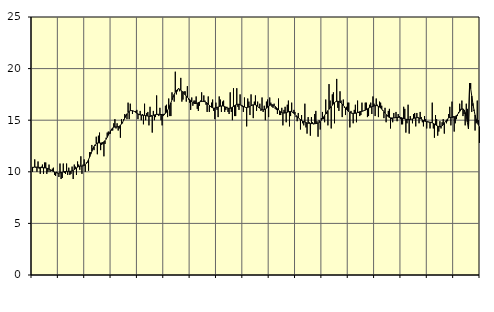
| Category | Piggar | Series 1 |
|---|---|---|
| nan | 10 | 10.45 |
| 87.0 | 10.4 | 10.44 |
| 87.0 | 11.2 | 10.46 |
| 87.0 | 10.4 | 10.46 |
| 87.0 | 10 | 10.45 |
| 87.0 | 11 | 10.44 |
| 87.0 | 10.3 | 10.43 |
| 87.0 | 9.8 | 10.42 |
| 87.0 | 10.5 | 10.41 |
| 87.0 | 10.7 | 10.4 |
| 87.0 | 9.8 | 10.39 |
| 87.0 | 10.9 | 10.38 |
| nan | 10.9 | 10.37 |
| 88.0 | 9.8 | 10.35 |
| 88.0 | 10 | 10.31 |
| 88.0 | 10.7 | 10.26 |
| 88.0 | 10 | 10.21 |
| 88.0 | 10.1 | 10.14 |
| 88.0 | 10.3 | 10.08 |
| 88.0 | 10.4 | 10.02 |
| 88.0 | 9.7 | 9.97 |
| 88.0 | 9.6 | 9.92 |
| 88.0 | 10 | 9.89 |
| 88.0 | 9.9 | 9.87 |
| nan | 9.5 | 9.87 |
| 89.0 | 10.8 | 9.89 |
| 89.0 | 9.3 | 9.92 |
| 89.0 | 9.4 | 9.95 |
| 89.0 | 10.8 | 9.99 |
| 89.0 | 9.9 | 10.02 |
| 89.0 | 9.8 | 10.03 |
| 89.0 | 10.8 | 10.04 |
| 89.0 | 9.7 | 10.04 |
| 89.0 | 10.4 | 10.04 |
| 89.0 | 9.7 | 10.04 |
| 89.0 | 9.8 | 10.06 |
| nan | 10.5 | 10.09 |
| 90.0 | 9.3 | 10.14 |
| 90.0 | 10.7 | 10.21 |
| 90.0 | 10.5 | 10.29 |
| 90.0 | 9.7 | 10.38 |
| 90.0 | 11 | 10.45 |
| 90.0 | 10.7 | 10.51 |
| 90.0 | 10.2 | 10.54 |
| 90.0 | 11.5 | 10.55 |
| 90.0 | 9.8 | 10.56 |
| 90.0 | 10.7 | 10.57 |
| 90.0 | 11.2 | 10.61 |
| nan | 10 | 10.69 |
| 91.0 | 10.9 | 10.81 |
| 91.0 | 10.9 | 10.98 |
| 91.0 | 10.1 | 11.19 |
| 91.0 | 11.9 | 11.44 |
| 91.0 | 11.9 | 11.71 |
| 91.0 | 12.6 | 11.98 |
| 91.0 | 12.3 | 12.23 |
| 91.0 | 12.1 | 12.45 |
| 91.0 | 12.5 | 12.62 |
| 91.0 | 13.4 | 12.73 |
| 91.0 | 11.7 | 12.79 |
| nan | 13.5 | 12.8 |
| 92.0 | 13.8 | 12.79 |
| 92.0 | 12.1 | 12.79 |
| 92.0 | 12.6 | 12.8 |
| 92.0 | 12.7 | 12.84 |
| 92.0 | 11.5 | 12.91 |
| 92.0 | 12.7 | 13.01 |
| 92.0 | 13.3 | 13.16 |
| 92.0 | 13.8 | 13.34 |
| 92.0 | 13.9 | 13.55 |
| 92.0 | 13.7 | 13.77 |
| 92.0 | 13.7 | 13.97 |
| nan | 14 | 14.14 |
| 93.0 | 14 | 14.26 |
| 93.0 | 14.7 | 14.32 |
| 93.0 | 15.1 | 14.34 |
| 93.0 | 14.2 | 14.35 |
| 93.0 | 14.7 | 14.35 |
| 93.0 | 14 | 14.37 |
| 93.0 | 14.2 | 14.42 |
| 93.0 | 13.3 | 14.51 |
| 93.0 | 15.1 | 14.63 |
| 93.0 | 14.7 | 14.8 |
| 93.0 | 15.1 | 15 |
| nan | 15.6 | 15.21 |
| 94.0 | 15.5 | 15.43 |
| 94.0 | 15.1 | 15.61 |
| 94.0 | 16.7 | 15.76 |
| 94.0 | 15.1 | 15.86 |
| 94.0 | 16.6 | 15.92 |
| 94.0 | 15.9 | 15.93 |
| 94.0 | 15.6 | 15.92 |
| 94.0 | 15.9 | 15.88 |
| 94.0 | 15.8 | 15.83 |
| 94.0 | 15.9 | 15.76 |
| 94.0 | 16 | 15.68 |
| nan | 15.1 | 15.61 |
| 95.0 | 15.6 | 15.55 |
| 95.0 | 15.9 | 15.51 |
| 95.0 | 15 | 15.49 |
| 95.0 | 15.6 | 15.48 |
| 95.0 | 14.6 | 15.48 |
| 95.0 | 16.6 | 15.47 |
| 95.0 | 15 | 15.45 |
| 95.0 | 15.7 | 15.42 |
| 95.0 | 15.8 | 15.4 |
| 95.0 | 14.5 | 15.37 |
| 95.0 | 16.3 | 15.37 |
| nan | 15.5 | 15.39 |
| 96.0 | 13.8 | 15.42 |
| 96.0 | 15.9 | 15.47 |
| 96.0 | 15 | 15.51 |
| 96.0 | 15.3 | 15.54 |
| 96.0 | 17.4 | 15.56 |
| 96.0 | 15.5 | 15.57 |
| 96.0 | 15.4 | 15.57 |
| 96.0 | 16.2 | 15.56 |
| 96.0 | 15 | 15.55 |
| 96.0 | 14.5 | 15.55 |
| 96.0 | 15.4 | 15.56 |
| nan | 15.5 | 15.59 |
| 97.0 | 16.4 | 15.66 |
| 97.0 | 16.5 | 15.78 |
| 97.0 | 15.3 | 15.96 |
| 97.0 | 17.1 | 16.17 |
| 97.0 | 15.4 | 16.42 |
| 97.0 | 15.4 | 16.69 |
| 97.0 | 17.7 | 16.97 |
| 97.0 | 17.3 | 17.25 |
| 97.0 | 16.8 | 17.5 |
| 97.0 | 19.7 | 17.72 |
| 97.0 | 17.5 | 17.88 |
| nan | 17.8 | 17.98 |
| 98.0 | 18.1 | 18.02 |
| 98.0 | 17.8 | 18 |
| 98.0 | 19.1 | 17.93 |
| 98.0 | 16.8 | 17.82 |
| 98.0 | 17 | 17.7 |
| 98.0 | 17.8 | 17.58 |
| 98.0 | 17.8 | 17.45 |
| 98.0 | 16.8 | 17.33 |
| 98.0 | 18.3 | 17.22 |
| 98.0 | 17 | 17.12 |
| 98.0 | 16.7 | 17.01 |
| nan | 16 | 16.9 |
| 99.0 | 17.2 | 16.8 |
| 99.0 | 16.4 | 16.71 |
| 99.0 | 16.9 | 16.65 |
| 99.0 | 16.9 | 16.61 |
| 99.0 | 17.3 | 16.62 |
| 99.0 | 16.1 | 16.65 |
| 99.0 | 15.9 | 16.71 |
| 99.0 | 16.4 | 16.76 |
| 99.0 | 16.9 | 16.8 |
| 99.0 | 17.7 | 16.81 |
| 99.0 | 16.8 | 16.82 |
| nan | 17.4 | 16.81 |
| 0.0 | 16.9 | 16.79 |
| 0.0 | 16.5 | 16.73 |
| 0.0 | 15.8 | 16.66 |
| 0.0 | 17.3 | 16.56 |
| 0.0 | 15.8 | 16.44 |
| 0.0 | 16.3 | 16.34 |
| 0.0 | 16.7 | 16.25 |
| 0.0 | 17 | 16.2 |
| 0.0 | 15.9 | 16.17 |
| 0.0 | 15.1 | 16.18 |
| 0.0 | 16.7 | 16.2 |
| nan | 16 | 16.24 |
| 1.0 | 15.3 | 16.28 |
| 1.0 | 17.3 | 16.32 |
| 1.0 | 17 | 16.36 |
| 1.0 | 15.8 | 16.38 |
| 1.0 | 16.8 | 16.38 |
| 1.0 | 16.9 | 16.36 |
| 1.0 | 15.8 | 16.32 |
| 1.0 | 16 | 16.26 |
| 1.0 | 16.3 | 16.2 |
| 1.0 | 15.8 | 16.16 |
| 1.0 | 15.6 | 16.15 |
| nan | 17.7 | 16.16 |
| 2.0 | 15.8 | 16.2 |
| 2.0 | 15 | 16.27 |
| 2.0 | 18.1 | 16.33 |
| 2.0 | 15.4 | 16.41 |
| 2.0 | 15.4 | 16.48 |
| 2.0 | 18.1 | 16.53 |
| 2.0 | 16.3 | 16.55 |
| 2.0 | 16 | 16.54 |
| 2.0 | 17.5 | 16.51 |
| 2.0 | 16.4 | 16.46 |
| 2.0 | 16.3 | 16.4 |
| nan | 15.8 | 16.34 |
| 3.0 | 17.2 | 16.28 |
| 3.0 | 16.2 | 16.24 |
| 3.0 | 14.4 | 16.23 |
| 3.0 | 17.1 | 16.24 |
| 3.0 | 16.8 | 16.28 |
| 3.0 | 15.5 | 16.33 |
| 3.0 | 17.5 | 16.4 |
| 3.0 | 16.5 | 16.45 |
| 3.0 | 15.2 | 16.49 |
| 3.0 | 16.8 | 16.51 |
| 3.0 | 17.4 | 16.48 |
| nan | 15.9 | 16.43 |
| 4.0 | 16.8 | 16.35 |
| 4.0 | 16.2 | 16.25 |
| 4.0 | 16.6 | 16.16 |
| 4.0 | 15.9 | 16.08 |
| 4.0 | 17.2 | 16.03 |
| 4.0 | 15.8 | 16.01 |
| 4.0 | 16.4 | 16.03 |
| 4.0 | 15 | 16.08 |
| 4.0 | 16.8 | 16.16 |
| 4.0 | 17 | 16.26 |
| 4.0 | 15.3 | 16.35 |
| nan | 17.2 | 16.42 |
| 5.0 | 16.7 | 16.48 |
| 5.0 | 16.3 | 16.5 |
| 5.0 | 16.2 | 16.48 |
| 5.0 | 16.6 | 16.42 |
| 5.0 | 16.1 | 16.34 |
| 5.0 | 16 | 16.22 |
| 5.0 | 15.6 | 16.11 |
| 5.0 | 17.1 | 15.99 |
| 5.0 | 15.5 | 15.9 |
| 5.0 | 15.5 | 15.81 |
| 5.0 | 16.2 | 15.75 |
| nan | 14.5 | 15.71 |
| 6.0 | 16 | 15.69 |
| 6.0 | 16.3 | 15.7 |
| 6.0 | 14.8 | 15.73 |
| 6.0 | 16.5 | 15.77 |
| 6.0 | 16.9 | 15.81 |
| 6.0 | 14.4 | 15.84 |
| 6.0 | 15.4 | 15.85 |
| 6.0 | 16.7 | 15.83 |
| 6.0 | 15.7 | 15.76 |
| 6.0 | 16 | 15.67 |
| 6.0 | 15.8 | 15.56 |
| nan | 15.3 | 15.45 |
| 7.0 | 14.9 | 15.34 |
| 7.0 | 15.7 | 15.23 |
| 7.0 | 15.1 | 15.14 |
| 7.0 | 14.1 | 15.06 |
| 7.0 | 15.5 | 14.98 |
| 7.0 | 14.7 | 14.92 |
| 7.0 | 14.5 | 14.87 |
| 7.0 | 16.6 | 14.82 |
| 7.0 | 14.3 | 14.77 |
| 7.0 | 13.7 | 14.73 |
| 7.0 | 15.3 | 14.71 |
| nan | 14.8 | 14.69 |
| 8.0 | 13.5 | 14.68 |
| 8.0 | 15.3 | 14.67 |
| 8.0 | 14.8 | 14.67 |
| 8.0 | 14.6 | 14.66 |
| 8.0 | 15.6 | 14.66 |
| 8.0 | 15.9 | 14.67 |
| 8.0 | 14.9 | 14.69 |
| 8.0 | 13.4 | 14.72 |
| 8.0 | 15 | 14.78 |
| 8.0 | 14.1 | 14.87 |
| 8.0 | 15.2 | 14.99 |
| nan | 15.8 | 15.13 |
| 9.0 | 15.1 | 15.3 |
| 9.0 | 14.8 | 15.47 |
| 9.0 | 17 | 15.63 |
| 9.0 | 15.6 | 15.79 |
| 9.0 | 14.5 | 15.93 |
| 9.0 | 18.5 | 16.06 |
| 9.0 | 16.9 | 16.19 |
| 9.0 | 14.2 | 16.32 |
| 9.0 | 17.5 | 16.45 |
| 9.0 | 17.7 | 16.58 |
| 9.0 | 14.7 | 16.7 |
| nan | 16.8 | 16.79 |
| 10.0 | 19 | 16.83 |
| 10.0 | 16.2 | 16.84 |
| 10.0 | 15.9 | 16.81 |
| 10.0 | 17.8 | 16.75 |
| 10.0 | 16.9 | 16.67 |
| 10.0 | 15.3 | 16.56 |
| 10.0 | 17 | 16.44 |
| 10.0 | 16.2 | 16.31 |
| 10.0 | 15.5 | 16.18 |
| 10.0 | 16.3 | 16.04 |
| 10.0 | 16.7 | 15.92 |
| nan | 16.7 | 15.83 |
| 11.0 | 14.3 | 15.76 |
| 11.0 | 15.9 | 15.7 |
| 11.0 | 15.7 | 15.67 |
| 11.0 | 14.7 | 15.66 |
| 11.0 | 16 | 15.66 |
| 11.0 | 16.5 | 15.67 |
| 11.0 | 14.8 | 15.7 |
| 11.0 | 16.9 | 15.74 |
| 11.0 | 15.7 | 15.78 |
| 11.0 | 15.4 | 15.82 |
| 11.0 | 15.5 | 15.85 |
| nan | 16.7 | 15.86 |
| 12.0 | 15.9 | 15.89 |
| 12.0 | 15.9 | 15.93 |
| 12.0 | 16.7 | 15.97 |
| 12.0 | 16.7 | 16.03 |
| 12.0 | 15.3 | 16.1 |
| 12.0 | 15.4 | 16.17 |
| 12.0 | 16.5 | 16.22 |
| 12.0 | 16.7 | 16.27 |
| 12.0 | 15.6 | 16.3 |
| 12.0 | 17.3 | 16.34 |
| 12.0 | 16.6 | 16.38 |
| nan | 15.4 | 16.41 |
| 13.0 | 17.1 | 16.42 |
| 13.0 | 16.5 | 16.39 |
| 13.0 | 15.3 | 16.34 |
| 13.0 | 16.8 | 16.27 |
| 13.0 | 16.7 | 16.18 |
| 13.0 | 16.4 | 16.08 |
| 13.0 | 15.9 | 15.96 |
| 13.0 | 15.2 | 15.83 |
| 13.0 | 16.2 | 15.69 |
| 13.0 | 14.8 | 15.56 |
| 13.0 | 15.5 | 15.43 |
| nan | 15.9 | 15.33 |
| 14.0 | 16.1 | 15.26 |
| 14.0 | 14.2 | 15.23 |
| 14.0 | 15.1 | 15.22 |
| 14.0 | 14.8 | 15.22 |
| 14.0 | 15.7 | 15.23 |
| 14.0 | 15.2 | 15.24 |
| 14.0 | 15.8 | 15.25 |
| 14.0 | 14.9 | 15.26 |
| 14.0 | 15.6 | 15.27 |
| 14.0 | 15.4 | 15.27 |
| 14.0 | 15.1 | 15.26 |
| nan | 14.6 | 15.24 |
| 15.0 | 14.6 | 15.2 |
| 15.0 | 16.3 | 15.16 |
| 15.0 | 16.1 | 15.12 |
| 15.0 | 13.8 | 15.09 |
| 15.0 | 14.7 | 15.08 |
| 15.0 | 16.5 | 15.07 |
| 15.0 | 13.7 | 15.06 |
| 15.0 | 15.4 | 15.07 |
| 15.0 | 15.1 | 15.09 |
| 15.0 | 14.7 | 15.12 |
| 15.0 | 15.6 | 15.16 |
| nan | 15.7 | 15.2 |
| 16.0 | 14.4 | 15.23 |
| 16.0 | 15.7 | 15.25 |
| 16.0 | 15.3 | 15.24 |
| 16.0 | 14.7 | 15.21 |
| 16.0 | 15.8 | 15.17 |
| 16.0 | 15.3 | 15.1 |
| 16.0 | 14.8 | 15.03 |
| 16.0 | 14.4 | 14.97 |
| 16.0 | 15.4 | 14.91 |
| 16.0 | 15.1 | 14.87 |
| 16.0 | 14.2 | 14.85 |
| nan | 14.9 | 14.83 |
| 17.0 | 14.8 | 14.82 |
| 17.0 | 14.2 | 14.81 |
| 17.0 | 14.8 | 14.78 |
| 17.0 | 16.7 | 14.74 |
| 17.0 | 14.2 | 14.69 |
| 17.0 | 13.3 | 14.63 |
| 17.0 | 15.5 | 14.56 |
| 17.0 | 15.1 | 14.49 |
| 17.0 | 13.5 | 14.43 |
| 17.0 | 13.9 | 14.39 |
| 17.0 | 14.9 | 14.37 |
| nan | 14.2 | 14.39 |
| 18.0 | 14.8 | 14.45 |
| 18.0 | 15.1 | 14.56 |
| 18.0 | 13.7 | 14.71 |
| 18.0 | 14.9 | 14.87 |
| 18.0 | 14.7 | 15.01 |
| 18.0 | 14.9 | 15.13 |
| 18.0 | 15.6 | 15.22 |
| 18.0 | 16.3 | 15.26 |
| 18.0 | 14.5 | 15.27 |
| 18.0 | 16.8 | 15.28 |
| 18.0 | 15.4 | 15.29 |
| nan | 13.9 | 15.33 |
| 19.0 | 14.7 | 15.37 |
| 19.0 | 15.1 | 15.45 |
| 19.0 | 15.4 | 15.55 |
| 19.0 | 15.8 | 15.69 |
| 19.0 | 16.6 | 15.84 |
| 19.0 | 16.1 | 15.99 |
| 19.0 | 16.9 | 16.09 |
| 19.0 | 15.4 | 16.1 |
| 19.0 | 15.6 | 16 |
| 19.0 | 14.5 | 15.75 |
| 19.0 | 16.6 | 15.34 |
| nan | 16.1 | 14.8 |
| 20.0 | 14.6 | 14.16 |
| 20.0 | 18.6 | 18.41 |
| 20.0 | 18.6 | 18.08 |
| 20.0 | 15.8 | 17.35 |
| 20.0 | 16.4 | 16.64 |
| 20.0 | 15.9 | 16.02 |
| 20.0 | 14 | 15.5 |
| 20.0 | 14.7 | 15.08 |
| 20.0 | 16.9 | 14.78 |
| 20.0 | 15 | 14.56 |
| 20.0 | 12.8 | 14.39 |